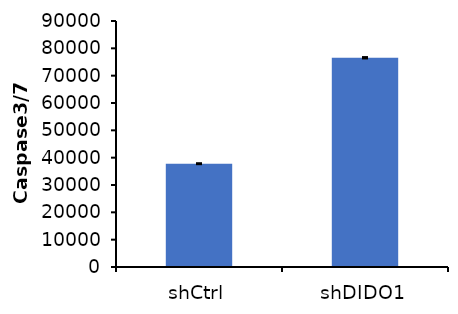
| Category | Series 0 |
|---|---|
| shCtrl | 37792.667 |
| shDIDO1 | 76553 |